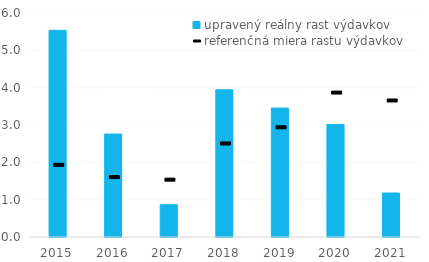
| Category | upravený reálny rast výdavkov |
|---|---|
| 0 | 5.537 |
| 1 | 2.759 |
| 2 | 0.865 |
| 3 | 3.943 |
| 4 | 3.453 |
| 5 | 3.014 |
| 6 | 1.178 |